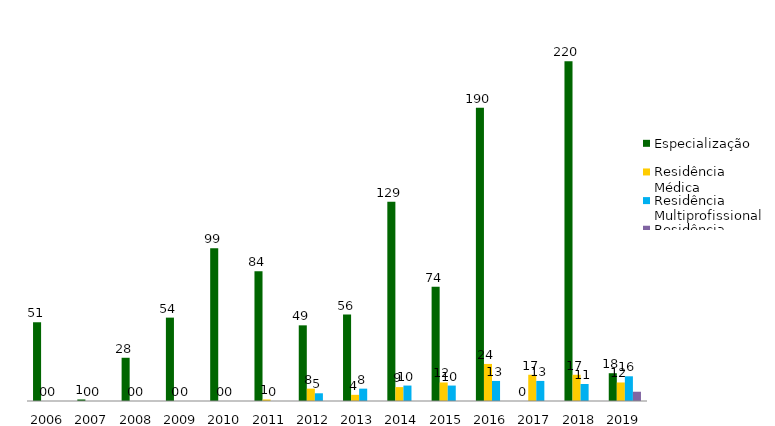
| Category | Especialização | Residência Médica | Residência Multiprofissional | Residência Uniprofissional |
|---|---|---|---|---|
| 2006.0 | 51 | 0 | 0 | 0 |
| 2007.0 | 1 | 0 | 0 | 0 |
| 2008.0 | 28 | 0 | 0 | 0 |
| 2009.0 | 54 | 0 | 0 | 0 |
| 2010.0 | 99 | 0 | 0 | 0 |
| 2011.0 | 84 | 1 | 0 | 0 |
| 2012.0 | 49 | 8 | 5 | 0 |
| 2013.0 | 56 | 4 | 8 | 0 |
| 2014.0 | 129 | 9 | 10 | 0 |
| 2015.0 | 74 | 12 | 10 | 0 |
| 2016.0 | 190 | 24 | 13 | 0 |
| 2017.0 | 0 | 17 | 13 | 0 |
| 2018.0 | 220 | 17 | 11 | 0 |
| 2019.0 | 18 | 12 | 16 | 6 |